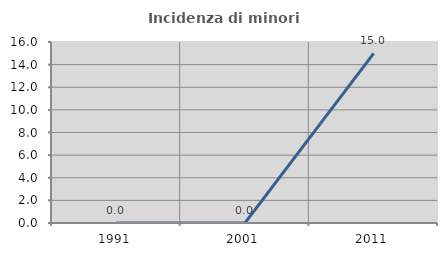
| Category | Incidenza di minori stranieri |
|---|---|
| 1991.0 | 0 |
| 2001.0 | 0 |
| 2011.0 | 15 |